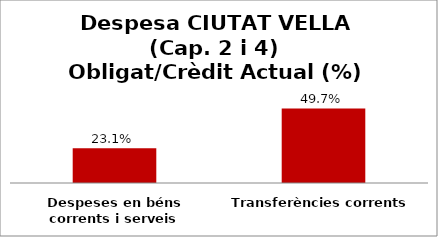
| Category | Series 0 |
|---|---|
| Despeses en béns corrents i serveis | 0.231 |
| Transferències corrents | 0.497 |